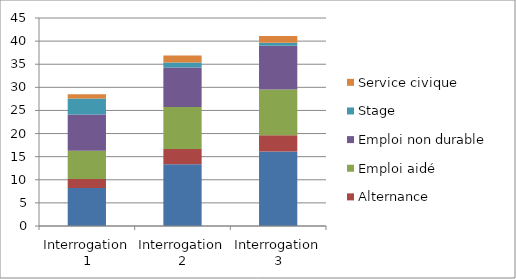
| Category | Emploi durable classique | Alternance | Emploi aidé | Emploi non durable | Stage | Service civique |
|---|---|---|---|---|---|---|
| Interrogation 1 | 8.21 | 1.97 | 6.12 | 7.81 | 3.45 | 0.96 |
| Interrogation 2 | 13.38 | 3.3 | 9.07 | 8.56 | 1.06 | 1.54 |
| Interrogation 3 | 16.1 | 3.55 | 9.87 | 9.47 | 0.68 | 1.44 |